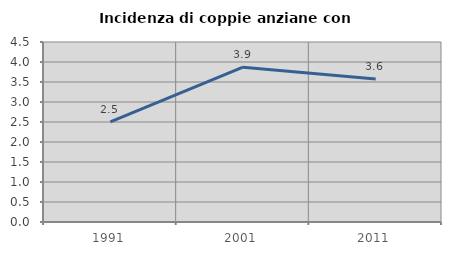
| Category | Incidenza di coppie anziane con figli |
|---|---|
| 1991.0 | 2.505 |
| 2001.0 | 3.872 |
| 2011.0 | 3.578 |